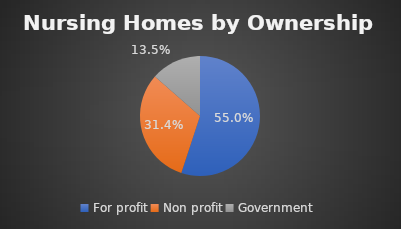
| Category | Series 0 |
|---|---|
| For profit | 0.55 |
| Non profit | 0.314 |
| Government | 0.135 |